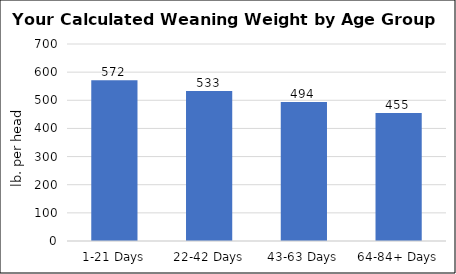
| Category | Series 0 |
|---|---|
| 1-21 Days | 571.55 |
| 22-42 Days | 532.7 |
| 43-63 Days | 493.85 |
| 64-84+ Days | 455 |